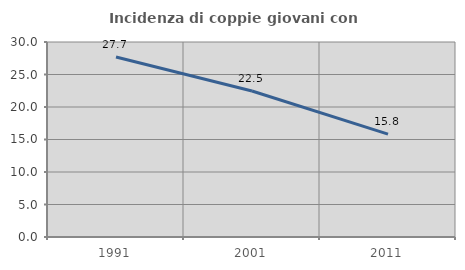
| Category | Incidenza di coppie giovani con figli |
|---|---|
| 1991.0 | 27.69 |
| 2001.0 | 22.457 |
| 2011.0 | 15.834 |